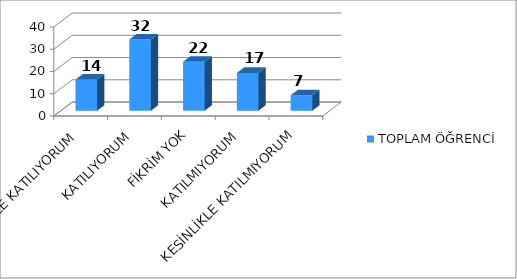
| Category | TOPLAM ÖĞRENCİ |
|---|---|
| KESİNLİKLE KATILIYORUM | 14 |
| KATILIYORUM | 32 |
| FİKRİM YOK | 22 |
| KATILMIYORUM | 17 |
| KESİNLİKLE KATILMIYORUM | 7 |